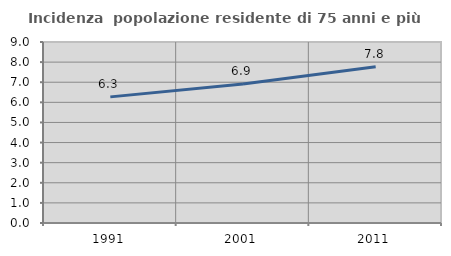
| Category | Incidenza  popolazione residente di 75 anni e più |
|---|---|
| 1991.0 | 6.272 |
| 2001.0 | 6.915 |
| 2011.0 | 7.773 |